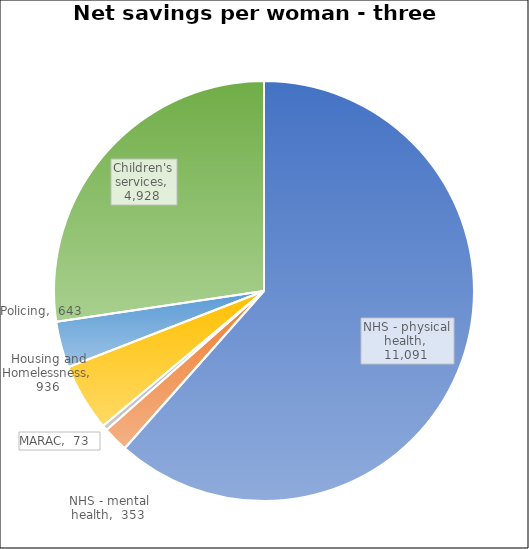
| Category | Series 0 |
|---|---|
| NHS - physical health | 11091 |
| NHS - mental health | 353 |
| MARAC | 73 |
| Housing and Homelessness | 936 |
| Policing | 643 |
| Children's services | 4928 |